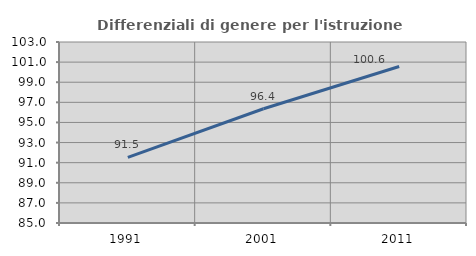
| Category | Differenziali di genere per l'istruzione superiore |
|---|---|
| 1991.0 | 91.519 |
| 2001.0 | 96.361 |
| 2011.0 | 100.567 |